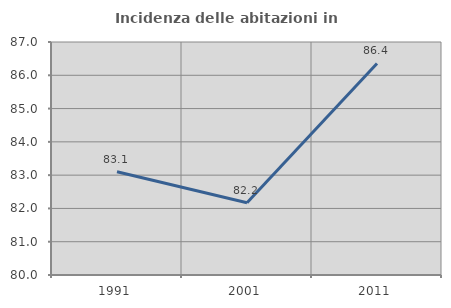
| Category | Incidenza delle abitazioni in proprietà  |
|---|---|
| 1991.0 | 83.101 |
| 2001.0 | 82.171 |
| 2011.0 | 86.355 |